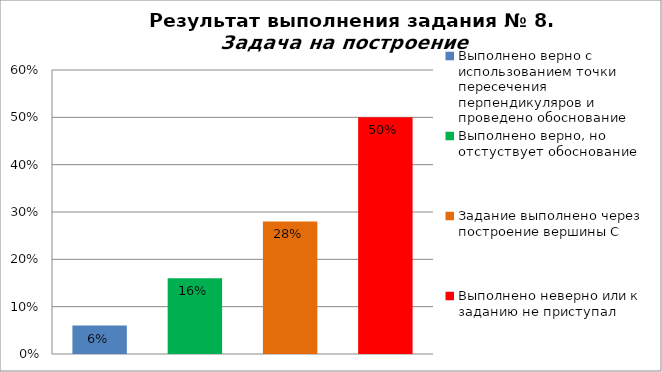
| Category | Задача на построение |
|---|---|
| Выполнено верно с использованием точки пересечения перпендикуляров и проведено обоснование | 0.06 |
| Выполнено верно, но отстуствует обоснование | 0.16 |
| Задание выполнено через построение вершины С | 0.28 |
| Выполнено неверно или к заданию не приступал | 0.5 |